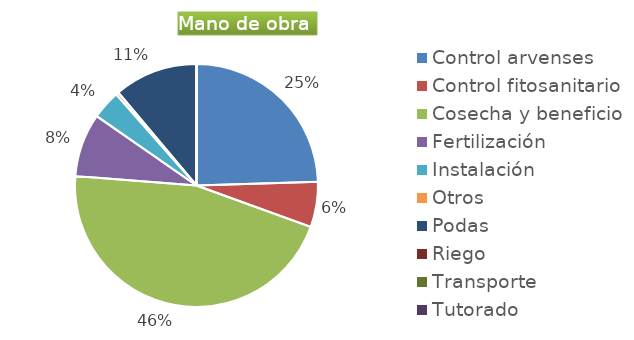
| Category | Series 0 |
|---|---|
| Control arvenses | 10866558 |
| Control fitosanitario | 2666640 |
| Cosecha y beneficio | 20266464 |
| Fertilización | 3733296 |
| Instalación | 1699983 |
| Otros | 166665 |
| Podas | 4933284 |
| Riego | 0 |
| Transporte | 0 |
| Tutorado | 0 |